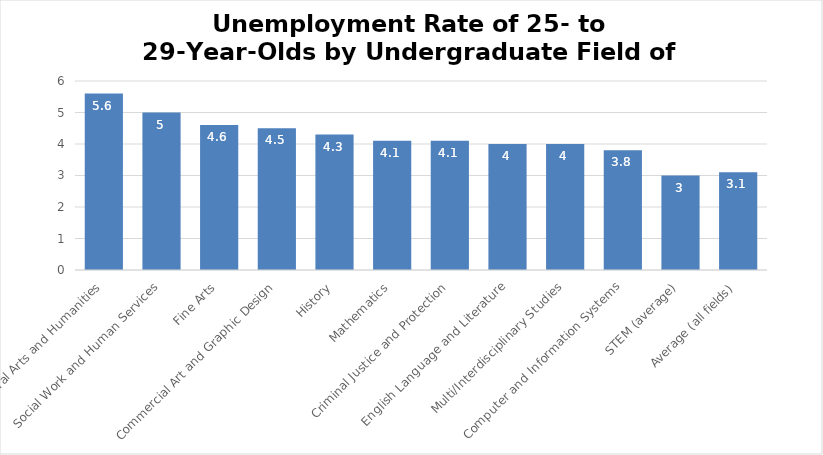
| Category | Unemployment Rate |
|---|---|
| Liberal Arts and Humanities | 5.6 |
| Social Work and Human Services | 5 |
| Fine Arts | 4.6 |
| Commercial Art and Graphic Design | 4.5 |
| History | 4.3 |
| Mathematics | 4.1 |
| Criminal Justice and Protection | 4.1 |
| English Language and Literature | 4 |
| Multi/Interdisciplinary Studies | 4 |
| Computer and Information Systems | 3.8 |
| STEM (average) | 3 |
| Average (all fields) | 3.1 |